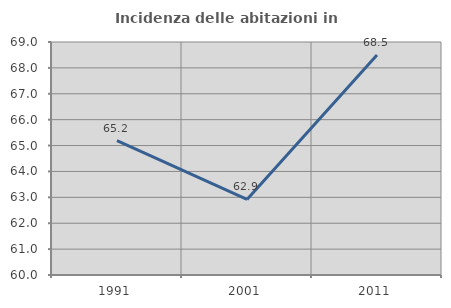
| Category | Incidenza delle abitazioni in proprietà  |
|---|---|
| 1991.0 | 65.191 |
| 2001.0 | 62.921 |
| 2011.0 | 68.501 |